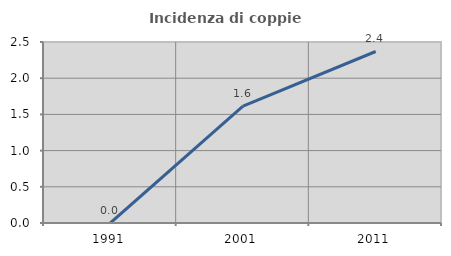
| Category | Incidenza di coppie miste |
|---|---|
| 1991.0 | 0 |
| 2001.0 | 1.613 |
| 2011.0 | 2.369 |